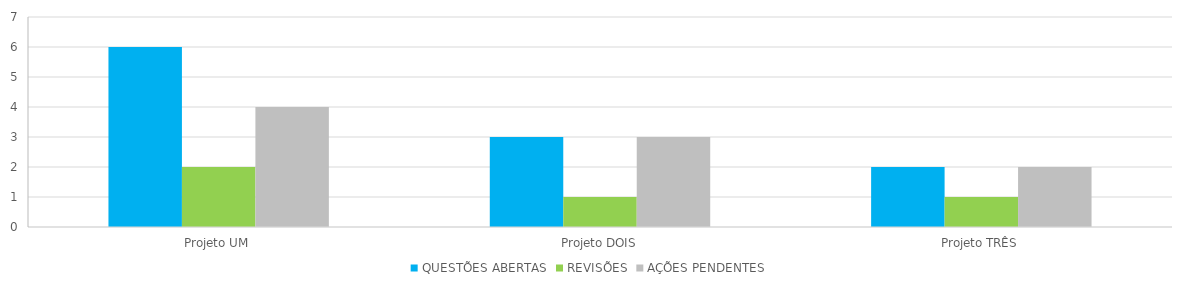
| Category | QUESTÕES ABERTAS | REVISÕES | AÇÕES PENDENTES |
|---|---|---|---|
| Projeto UM | 6 | 2 | 4 |
| Projeto DOIS | 3 | 1 | 3 |
| Projeto TRÊS | 2 | 1 | 2 |